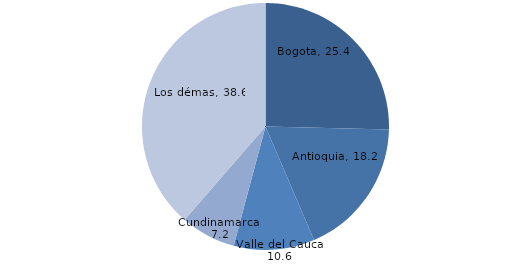
| Category | Series 0 |
|---|---|
| Bogota | 25.398 |
| Antioquia | 18.174 |
| Valle del Cauca | 10.579 |
| Cundinamarca | 7.219 |
| Los démas | 38.63 |